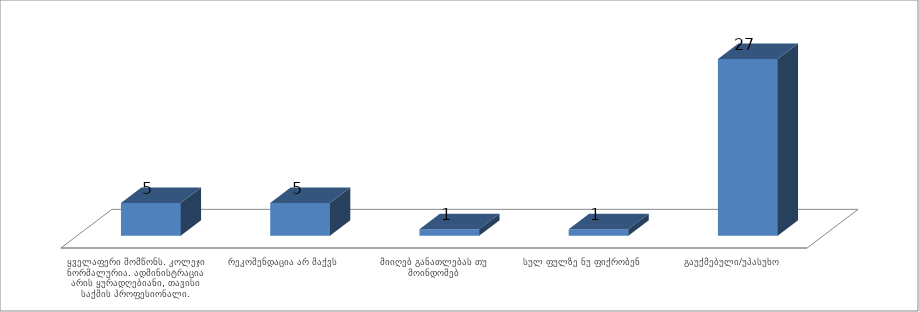
| Category | Series 0 |
|---|---|
| ყველაფერი მომწონს. კოლეჯი ნორმალურია. ადმინისტრაცია არის ყურადღებიანი, თავისი საქმის პროფესიონალი. | 5 |
| რეკომენდაცია არ მაქვს | 5 |
| მიიღებ განათლებას თუ მოინდომებ | 1 |
| სულ ფულზე ნუ ფიქრობენ | 1 |
| გაუქმებული/უპასუხო | 27 |